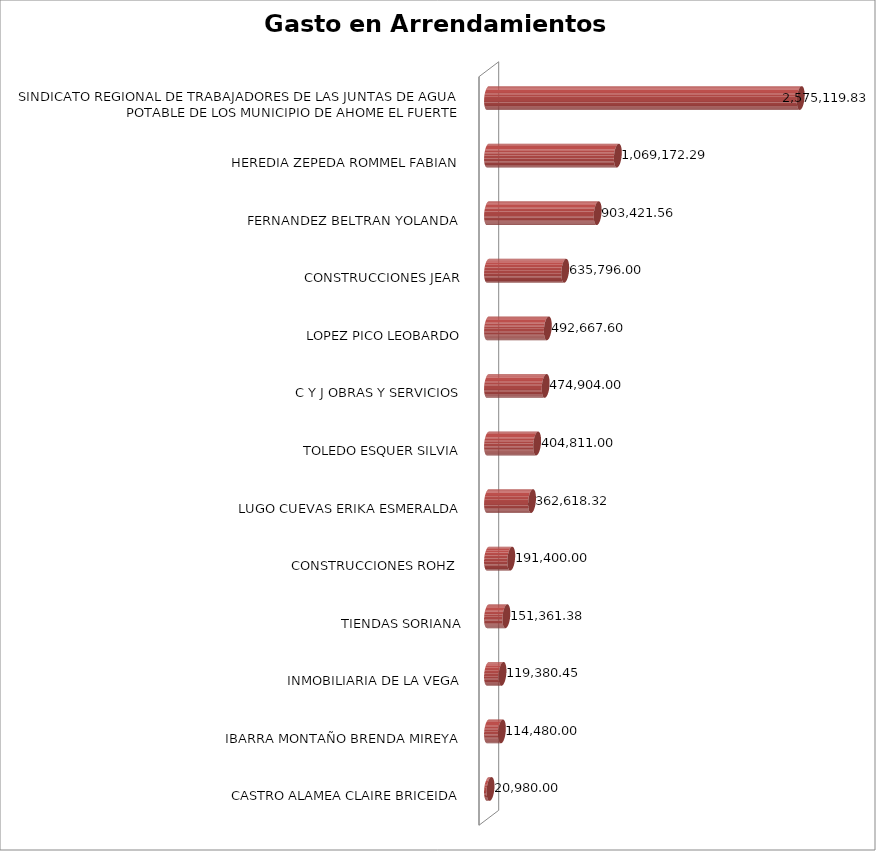
| Category | Suma  |
|---|---|
| CASTRO ALAMEA CLAIRE BRICEIDA | 20980 |
| IBARRA MONTAÑO BRENDA MIREYA | 114480 |
| INMOBILIARIA DE LA VEGA | 119380.45 |
| TIENDAS SORIANA | 151361.38 |
| CONSTRUCCIONES ROHZ  | 191400 |
| LUGO CUEVAS ERIKA ESMERALDA | 362618.32 |
| TOLEDO ESQUER SILVIA | 404811 |
| C Y J OBRAS Y SERVICIOS | 474904 |
| LOPEZ PICO LEOBARDO | 492667.6 |
| CONSTRUCCIONES JEAR | 635796 |
| FERNANDEZ BELTRAN YOLANDA | 903421.56 |
| HEREDIA ZEPEDA ROMMEL FABIAN | 1069172.29 |
| SINDICATO REGIONAL DE TRABAJADORES DE LAS JUNTAS DE AGUA POTABLE DE LOS MUNICIPIO DE AHOME EL FUERTE | 2575119.83 |